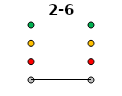
| Category | 0 | 1 | 2 | 3 | 2-6 |
|---|---|---|---|---|---|
| Time 1 | 0 | 1 | 2 | 3 | 0 |
| Time 2 | 0 | 1 | 2 | 3 | 0 |